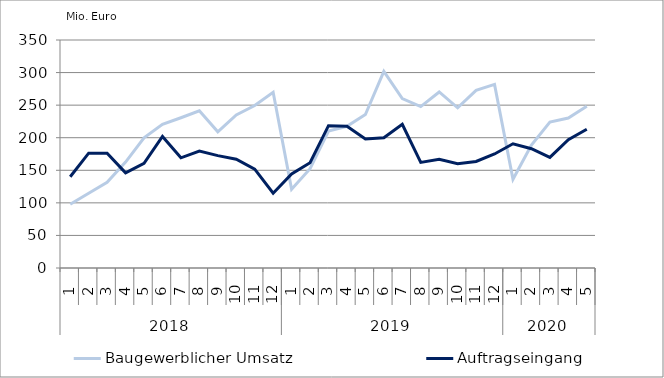
| Category | Baugewerblicher Umsatz | Auftragseingang |
|---|---|---|
| 0 | 97959.056 | 140119.385 |
| 1 | 114756.787 | 176330.213 |
| 2 | 131454.642 | 176241.061 |
| 3 | 162648.053 | 146063.407 |
| 4 | 199809.407 | 160551.931 |
| 5 | 220535.974 | 201835.846 |
| 6 | 230672.472 | 169132.23 |
| 7 | 241233.619 | 179396.293 |
| 8 | 209099.292 | 172542.764 |
| 9 | 234953.007 | 166991.729 |
| 10 | 249410.043 | 151835.629 |
| 11 | 269773.227 | 114807.456 |
| 12 | 120975.133 | 144510.881 |
| 13 | 152329.786 | 161685.201 |
| 14 | 210227.67 | 218455.879 |
| 15 | 217522.321 | 217610.064 |
| 16 | 235490.429 | 198110.439 |
| 17 | 301963.302 | 200012.086 |
| 18 | 259975.317 | 220559.061 |
| 19 | 247779.658 | 162059.723 |
| 20 | 270249.609 | 166829.611 |
| 21 | 245966.91 | 160120.773 |
| 22 | 272620.351 | 163589.389 |
| 23 | 281810.121 | 175051.247 |
| 24 | 136135.432 | 190647.086 |
| 25 | 188682.361 | 183141.14 |
| 26 | 224009.315 | 169770.009 |
| 27 | 230172.252 | 196979.845 |
| 28 | 248410.714 | 212955.83 |